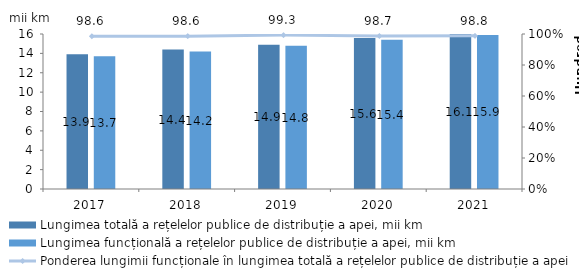
| Category | Lungimea totală a rețelelor publice de distribuție a apei, mii km | Lungimea funcțională a rețelelor publice de distribuție a apei, mii km |
|---|---|---|
| 2017.0 | 13.9 | 13.7 |
| 2018.0 | 14.4 | 14.2 |
| 2019.0 | 14.9 | 14.8 |
| 2020.0 | 15.6 | 15.4 |
| 2021.0 | 16.1 | 15.9 |